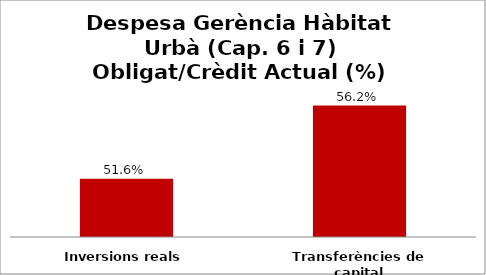
| Category | Series 0 |
|---|---|
| Inversions reals | 0.516 |
| Transferències de capital | 0.562 |